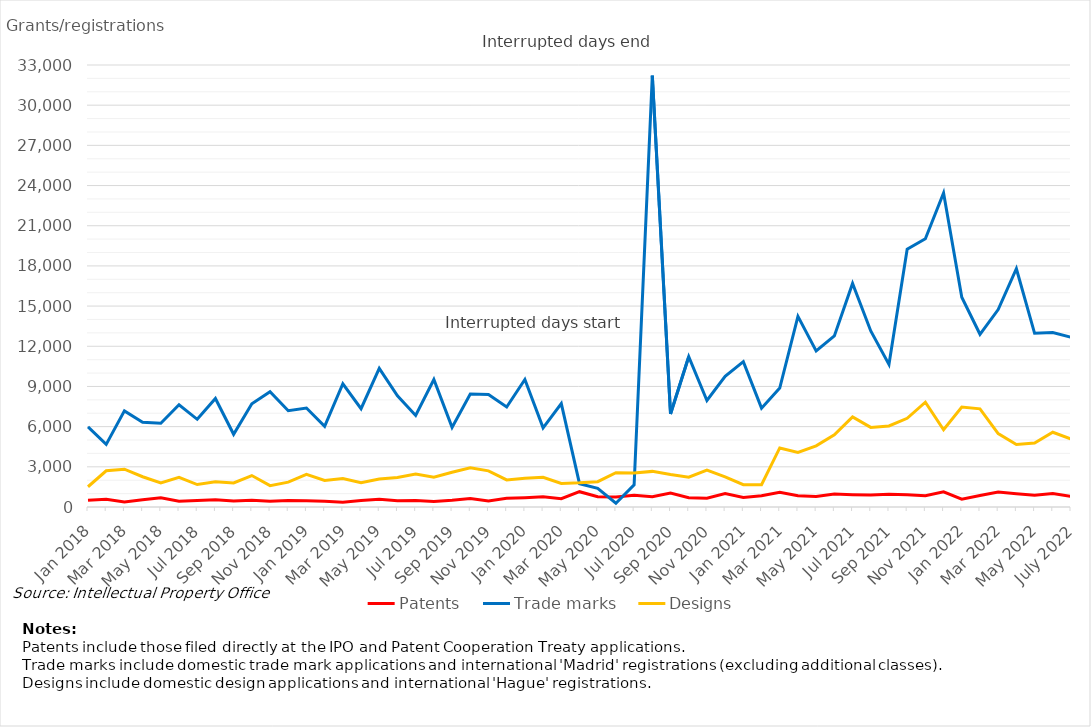
| Category | Patents | Trade marks | Designs |
|---|---|---|---|
| Jan 2018 | 495 | 5979 | 1512 |
| Feb 2018 | 574 | 4672 | 2704 |
| Mar 2018 | 370 | 7178 | 2825 |
| Apr 2018 | 543 | 6333 | 2259 |
| May 2018 | 690 | 6252 | 1789 |
| Jun 2018 | 424 | 7636 | 2222 |
| Jul 2018 | 486 | 6548 | 1678 |
| Aug 2018 | 536 | 8104 | 1878 |
| Sep 2018 | 450 | 5429 | 1795 |
| Oct 2018 | 498 | 7701 | 2348 |
| Nov 2018 | 432 | 8603 | 1592 |
| Dec 2018 | 484 | 7190 | 1859 |
| Jan 2019 | 474 | 7392 | 2444 |
| Feb 2019 | 426 | 6023 | 1987 |
| Mar 2019 | 363 | 9201 | 2125 |
| Apr 2019 | 488 | 7336 | 1810 |
| May 2019 | 573 | 10344 | 2096 |
| Jun 2019 | 471 | 8304 | 2202 |
| Jul 2019 | 489 | 6839 | 2464 |
| Aug 2019 | 420 | 9517 | 2218 |
| Sep 2019 | 500 | 5943 | 2596 |
| Oct 2019 | 634 | 8435 | 2926 |
| Nov 2019 | 455 | 8400 | 2700 |
| Dec 2019 | 654 | 7465 | 2021 |
| Jan 2020 | 696 | 9525 | 2145 |
| Feb 2020 | 756 | 5908 | 2220 |
| Mar 2020 | 622 | 7722 | 1757 |
| Apr 2020 | 1143 | 1742 | 1803 |
| May 2020 | 768 | 1399 | 1888 |
| Jun 2020 | 740 | 280 | 2564 |
| Jul 2020 | 878 | 1659 | 2539 |
| Aug 2020 | 771 | 32204 | 2659 |
| Sep 2020 | 1042 | 6947 | 2425 |
| Oct 2020 | 697 | 11221 | 2223 |
| Nov 2020 | 649 | 7954 | 2763 |
| Dec 2020 | 1010 | 9749 | 2252 |
| Jan 2021 | 708 | 10856 | 1665 |
| Feb 2021 | 838 | 7380 | 1660 |
| Mar 2021 | 1107 | 8877 | 4408 |
| Apr 2021 | 838 | 14232 | 4075 |
| May 2021 | 788 | 11653 | 4562 |
| Jun 2021 | 972 | 12772 | 5385 |
| Jul 2021 | 918 | 16695 | 6731 |
| Aug 2021 | 887 | 13145 | 5944 |
| Sep 2021 | 947 | 10649 | 6050 |
| Oct 2021 | 920 | 19251 | 6621 |
| Nov 2021 | 841 | 20029 | 7822 |
| Dec 2021 | 1131 | 23453 | 5764 |
| Jan 2022 | 585 | 15663 | 7460 |
| Feb 2022 | 860 | 12896 | 7331 |
| Mar 2022 | 1111 | 14744 | 5482 |
| Apr 2022 | 990 | 17789 | 4668 |
| May 2022 | 883 | 12967 | 4771 |
| June 2022 | 1010 | 13021 | 5580 |
| July 2022 | 788 | 12671 | 5084 |